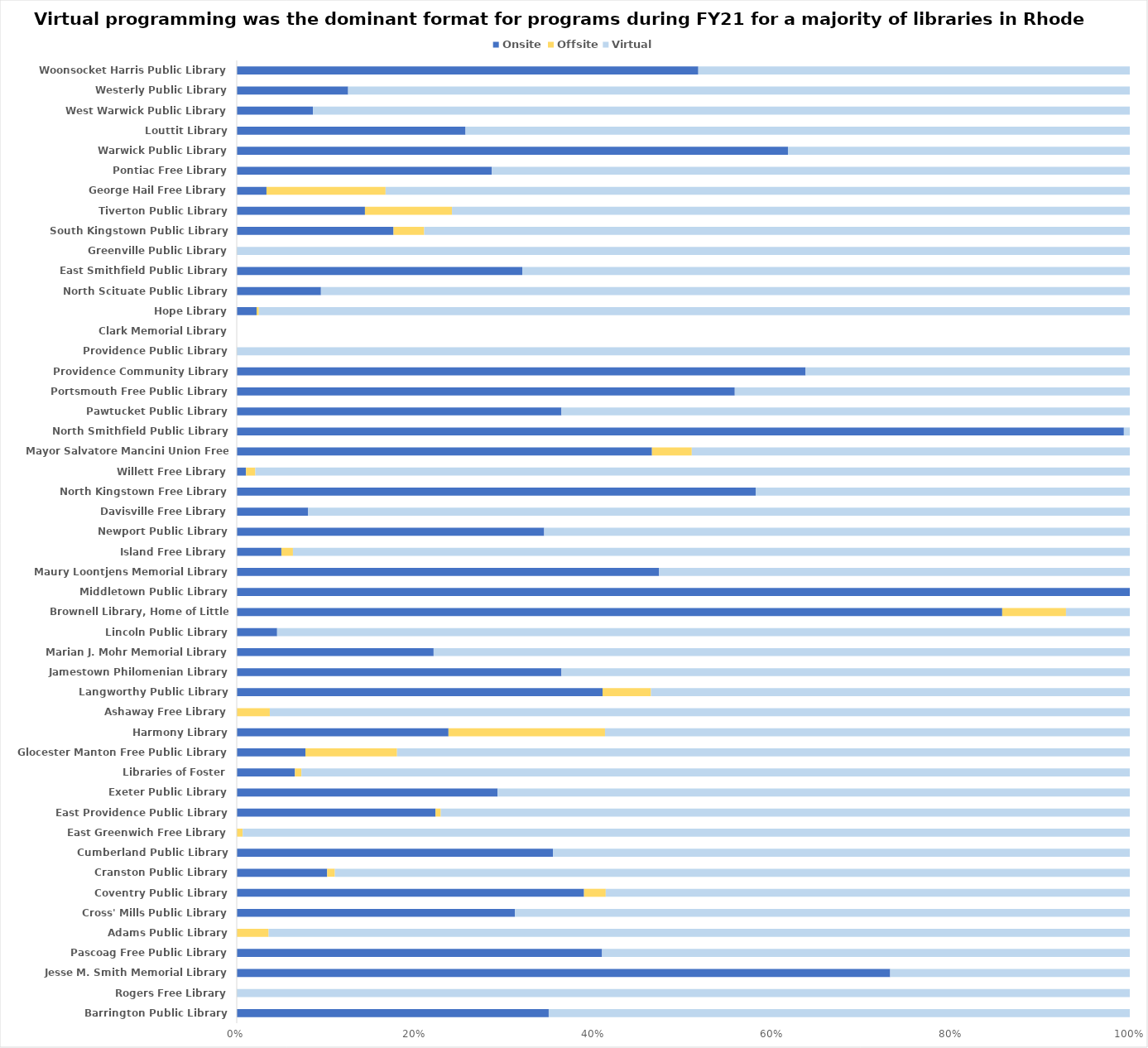
| Category | Onsite | Offsite | Virtual |
|---|---|---|---|
| Barrington Public Library | 80 | 0 | 149 |
| Rogers Free Library | 0 | 0 | 315 |
| Jesse M. Smith Memorial Library | 60 | 0 | 22 |
| Pascoag Free Public Library | 9 | 0 | 13 |
| Adams Public Library | 0 | 1 | 27 |
| Cross' Mills Public Library | 76 | 0 | 168 |
| Coventry Public Library | 112 | 7 | 169 |
| Cranston Public Library | 47 | 4 | 413 |
| Cumberland Public Library | 171 | 0 | 312 |
| East Greenwich Free Library | 0 | 1 | 148 |
| East Providence Public Library | 189 | 5 | 655 |
| Exeter Public Library | 26 | 0 | 63 |
| Libraries of Foster | 9 | 1 | 128 |
| Glocester Manton Free Public Library | 3 | 4 | 32 |
| Harmony Library | 23 | 17 | 57 |
| Ashaway Free Library | 0 | 2 | 52 |
| Langworthy Public Library | 68 | 9 | 89 |
| Jamestown Philomenian Library | 44 | 0 | 77 |
| Marian J. Mohr Memorial Library | 28 | 0 | 99 |
| Lincoln Public Library | 9 | 0 | 190 |
| Brownell Library, Home of Little Compton | 12 | 1 | 1 |
| Middletown Public Library | 2 | 0 | 0 |
| Maury Loontjens Memorial Library | 35 | 0 | 39 |
| Island Free Library | 27 | 7 | 506 |
| Newport Public Library | 42 | 0 | 80 |
| Davisville Free Library | 4 | 0 | 46 |
| North Kingstown Free Library | 129 | 0 | 93 |
| Willett Free Library | 1 | 1 | 94 |
| Mayor Salvatore Mancini Union Free Library | 73 | 7 | 77 |
| North Smithfield Public Library | 300 | 0 | 2 |
| Pawtucket Public Library | 8 | 0 | 14 |
| Portsmouth Free Public Library | 29 | 0 | 23 |
| Providence Community Library | 1767 | 0 | 1007 |
| Providence Public Library | 0 | 0 | 2522 |
| Clark Memorial Library | 0 | 0 | 0 |
| Hope Library | 9 | 1 | 394 |
| North Scituate Public Library | 10 | 0 | 96 |
| East Smithfield Public Library | 55 | 0 | 117 |
| Greenville Public Library | 0 | 0 | 246 |
| South Kingstown Public Library | 46 | 9 | 207 |
| Tiverton Public Library | 28 | 19 | 148 |
| George Hail Free Library | 1 | 4 | 25 |
| Pontiac Free Library | 2 | 0 | 5 |
| Warwick Public Library | 129 | 0 | 80 |
| Louttit Library | 31 | 0 | 90 |
| West Warwick Public Library | 46 | 0 | 493 |
| Westerly Public Library | 61 | 0 | 428 |
| Woonsocket Harris Public Library | 46 | 0 | 43 |